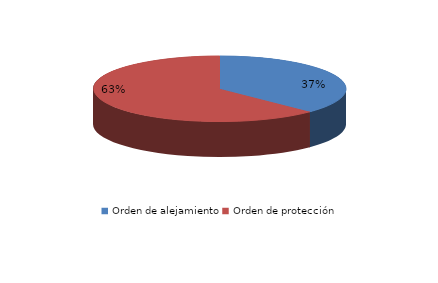
| Category | Series 0 |
|---|---|
| Orden de alejamiento | 65 |
| Orden de protección | 109 |